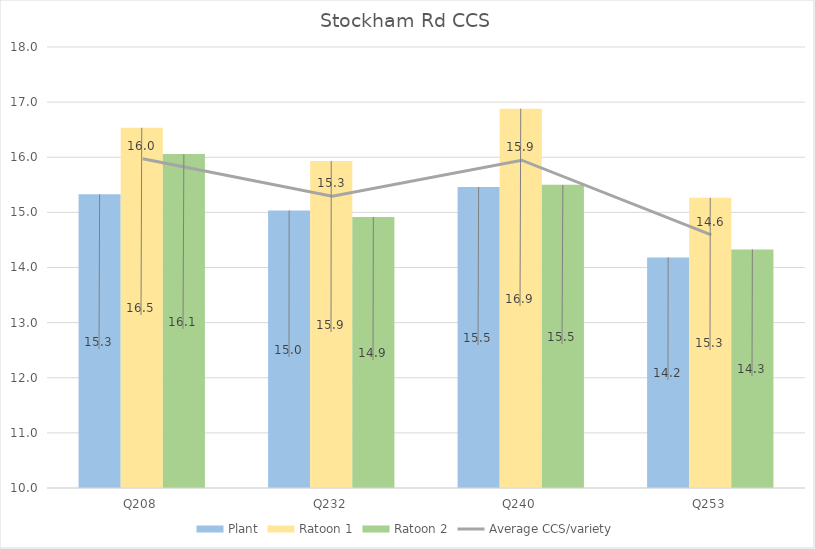
| Category | Plant | Ratoon 1 | Ratoon 2 |
|---|---|---|---|
| Q208 | 15.328 | 16.534 | 16.058 |
| Q232 | 15.034 | 15.933 | 14.916 |
| Q240 | 15.461 | 16.881 | 15.499 |
| Q253 | 14.183 | 15.266 | 14.328 |